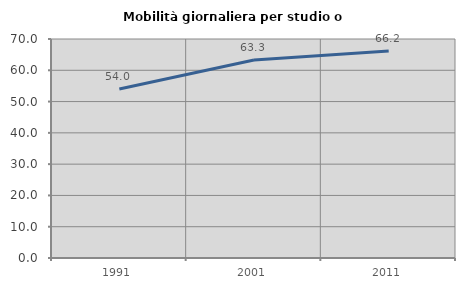
| Category | Mobilità giornaliera per studio o lavoro |
|---|---|
| 1991.0 | 54.021 |
| 2001.0 | 63.265 |
| 2011.0 | 66.152 |